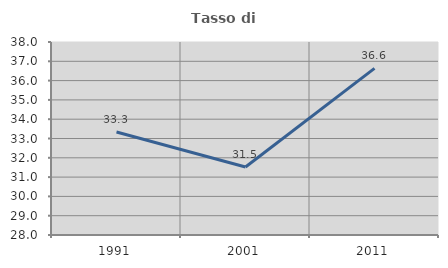
| Category | Tasso di occupazione   |
|---|---|
| 1991.0 | 33.333 |
| 2001.0 | 31.525 |
| 2011.0 | 36.635 |